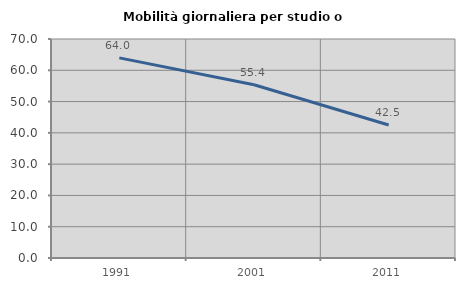
| Category | Mobilità giornaliera per studio o lavoro |
|---|---|
| 1991.0 | 63.968 |
| 2001.0 | 55.385 |
| 2011.0 | 42.515 |